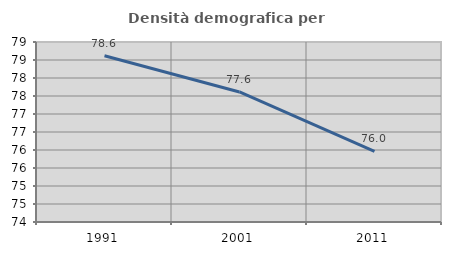
| Category | Densità demografica |
|---|---|
| 1991.0 | 78.617 |
| 2001.0 | 77.611 |
| 2011.0 | 75.962 |